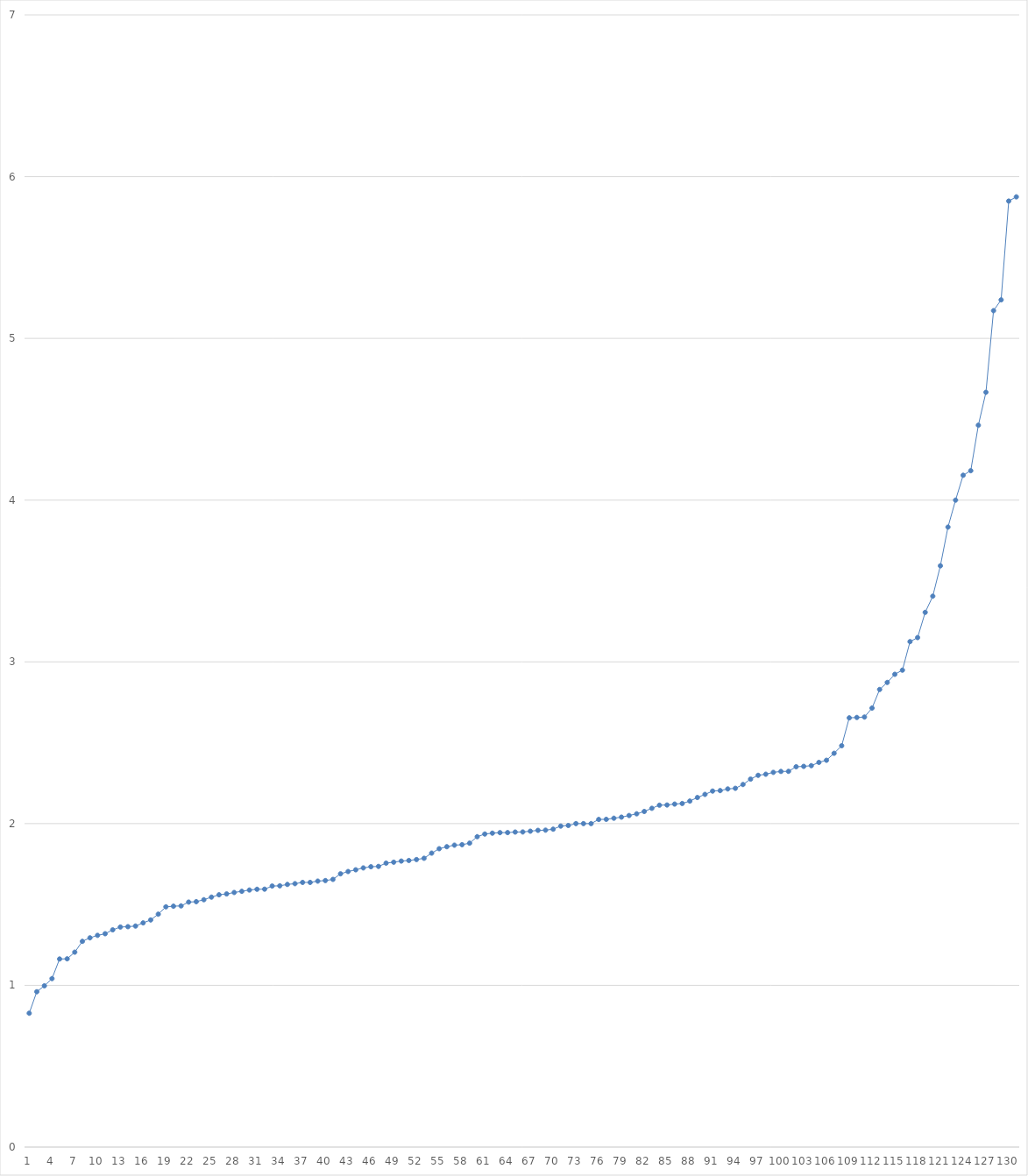
| Category | Series 0 |
|---|---|
| 0 | 0.828 |
| 1 | 0.96 |
| 2 | 0.997 |
| 3 | 1.042 |
| 4 | 1.163 |
| 5 | 1.164 |
| 6 | 1.205 |
| 7 | 1.272 |
| 8 | 1.294 |
| 9 | 1.309 |
| 10 | 1.319 |
| 11 | 1.343 |
| 12 | 1.36 |
| 13 | 1.363 |
| 14 | 1.367 |
| 15 | 1.386 |
| 16 | 1.404 |
| 17 | 1.44 |
| 18 | 1.485 |
| 19 | 1.489 |
| 20 | 1.491 |
| 21 | 1.515 |
| 22 | 1.517 |
| 23 | 1.529 |
| 24 | 1.545 |
| 25 | 1.56 |
| 26 | 1.565 |
| 27 | 1.574 |
| 28 | 1.581 |
| 29 | 1.589 |
| 30 | 1.594 |
| 31 | 1.595 |
| 32 | 1.614 |
| 33 | 1.615 |
| 34 | 1.624 |
| 35 | 1.629 |
| 36 | 1.636 |
| 37 | 1.636 |
| 38 | 1.644 |
| 39 | 1.648 |
| 40 | 1.655 |
| 41 | 1.689 |
| 42 | 1.704 |
| 43 | 1.714 |
| 44 | 1.726 |
| 45 | 1.733 |
| 46 | 1.735 |
| 47 | 1.756 |
| 48 | 1.761 |
| 49 | 1.768 |
| 50 | 1.772 |
| 51 | 1.778 |
| 52 | 1.786 |
| 53 | 1.817 |
| 54 | 1.845 |
| 55 | 1.857 |
| 56 | 1.867 |
| 57 | 1.87 |
| 58 | 1.879 |
| 59 | 1.919 |
| 60 | 1.935 |
| 61 | 1.941 |
| 62 | 1.944 |
| 63 | 1.944 |
| 64 | 1.948 |
| 65 | 1.948 |
| 66 | 1.953 |
| 67 | 1.958 |
| 68 | 1.959 |
| 69 | 1.966 |
| 70 | 1.985 |
| 71 | 1.988 |
| 72 | 2 |
| 73 | 2 |
| 74 | 2 |
| 75 | 2.026 |
| 76 | 2.026 |
| 77 | 2.033 |
| 78 | 2.04 |
| 79 | 2.05 |
| 80 | 2.061 |
| 81 | 2.075 |
| 82 | 2.095 |
| 83 | 2.114 |
| 84 | 2.115 |
| 85 | 2.121 |
| 86 | 2.124 |
| 87 | 2.139 |
| 88 | 2.161 |
| 89 | 2.181 |
| 90 | 2.201 |
| 91 | 2.204 |
| 92 | 2.214 |
| 93 | 2.218 |
| 94 | 2.242 |
| 95 | 2.275 |
| 96 | 2.299 |
| 97 | 2.305 |
| 98 | 2.317 |
| 99 | 2.323 |
| 100 | 2.323 |
| 101 | 2.352 |
| 102 | 2.354 |
| 103 | 2.358 |
| 104 | 2.378 |
| 105 | 2.392 |
| 106 | 2.435 |
| 107 | 2.481 |
| 108 | 2.654 |
| 109 | 2.656 |
| 110 | 2.659 |
| 111 | 2.714 |
| 112 | 2.829 |
| 113 | 2.873 |
| 114 | 2.923 |
| 115 | 2.949 |
| 116 | 3.125 |
| 117 | 3.15 |
| 118 | 3.306 |
| 119 | 3.406 |
| 120 | 3.594 |
| 121 | 3.833 |
| 122 | 4 |
| 123 | 4.154 |
| 124 | 4.182 |
| 125 | 4.463 |
| 126 | 4.667 |
| 127 | 5.171 |
| 128 | 5.238 |
| 129 | 5.849 |
| 130 | 5.875 |